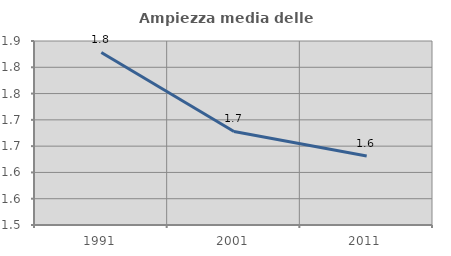
| Category | Ampiezza media delle famiglie |
|---|---|
| 1991.0 | 1.828 |
| 2001.0 | 1.678 |
| 2011.0 | 1.631 |